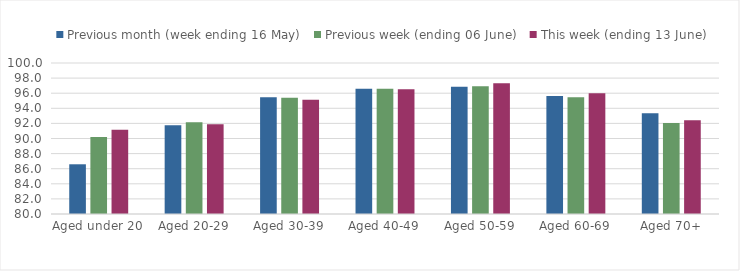
| Category | Previous month (week ending 16 May) | Previous week (ending 06 June) | This week (ending 13 June) |
|---|---|---|---|
| Aged under 20 | 86.585 | 90.195 | 91.151 |
| Aged 20-29 | 91.769 | 92.151 | 91.88 |
| Aged 30-39 | 95.472 | 95.406 | 95.128 |
| Aged 40-49 | 96.578 | 96.581 | 96.527 |
| Aged 50-59 | 96.838 | 96.906 | 97.321 |
| Aged 60-69 | 95.634 | 95.467 | 95.982 |
| Aged 70+ | 93.352 | 92.046 | 92.401 |